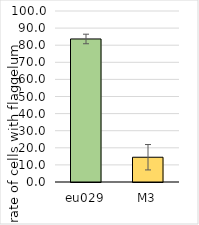
| Category | Series 0 |
|---|---|
| eu029 | 83.644 |
| M3 | 14.48 |